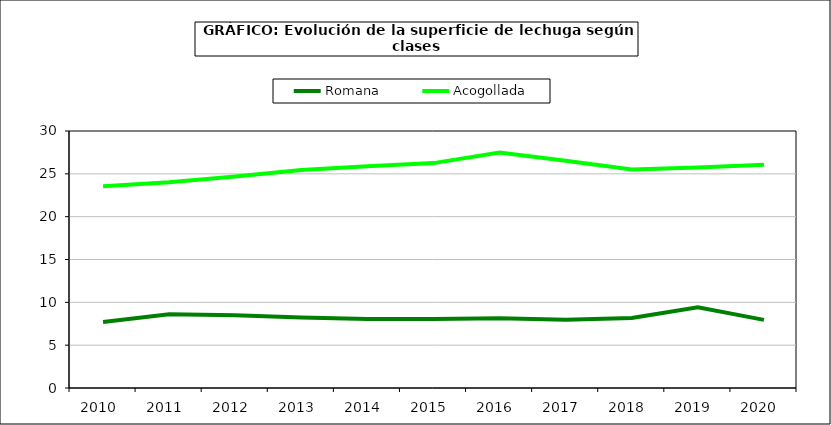
| Category | Romana | Acogollada |
|---|---|---|
| 2010.0 | 7.707 | 23.549 |
| 2011.0 | 8.605 | 24.015 |
| 2012.0 | 8.497 | 24.699 |
| 2013.0 | 8.23 | 25.438 |
| 2014.0 | 8.041 | 25.883 |
| 2015.0 | 8.063 | 26.251 |
| 2016.0 | 8.145 | 27.501 |
| 2017.0 | 7.972 | 26.536 |
| 2018.0 | 8.166 | 25.508 |
| 2019.0 | 9.434 | 25.734 |
| 2020.0 | 7.956 | 26.049 |